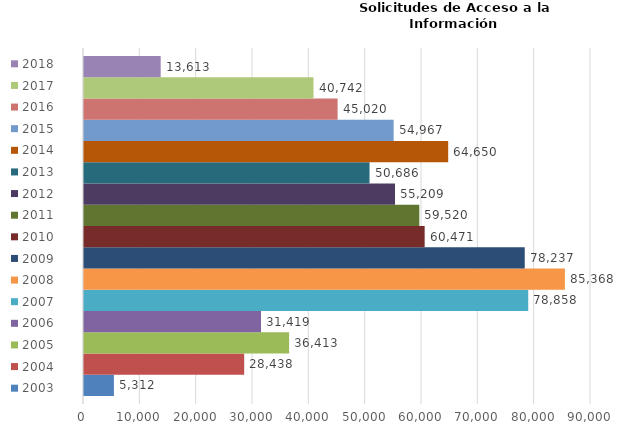
| Category | 2003 | 2004 | 2005 | 2006 | 2007 | 2008 | 2009 | 2010 | 2011 | 2012 | 2013 | 2014 | 2015 | 2016 | 2017 | 2018 |
|---|---|---|---|---|---|---|---|---|---|---|---|---|---|---|---|---|
| 0 | 5312 | 28438 | 36413 | 31419 | 78858 | 85368 | 78237 | 60471 | 59520 | 55209 | 50686 | 64650 | 54967 | 45020 | 40742 | 13613 |